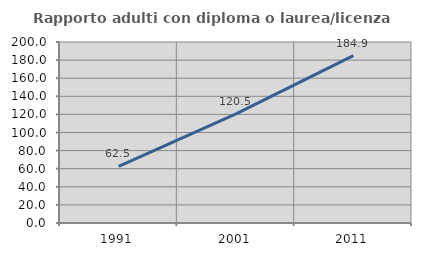
| Category | Rapporto adulti con diploma o laurea/licenza media  |
|---|---|
| 1991.0 | 62.5 |
| 2001.0 | 120.548 |
| 2011.0 | 184.874 |